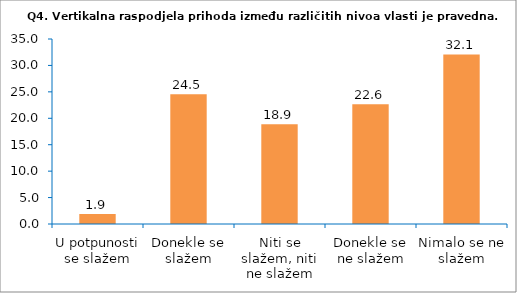
| Category | Series 0 |
|---|---|
| U potpunosti se slažem | 1.887 |
| Donekle se slažem | 24.528 |
| Niti se slažem, niti ne slažem | 18.868 |
| Donekle se ne slažem | 22.642 |
| Nimalo se ne slažem | 32.075 |